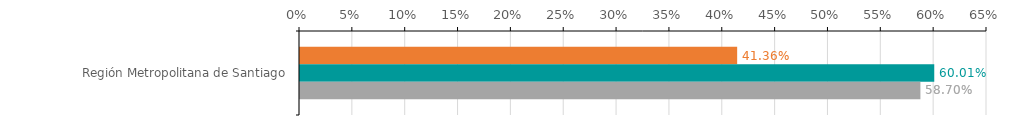
| Category | Numero de operaciones | Monto ($ MM) | Garantia ($ MM) |
|---|---|---|---|
| Región Metropolitana de Santiago | 0.414 | 0.6 | 0.587 |